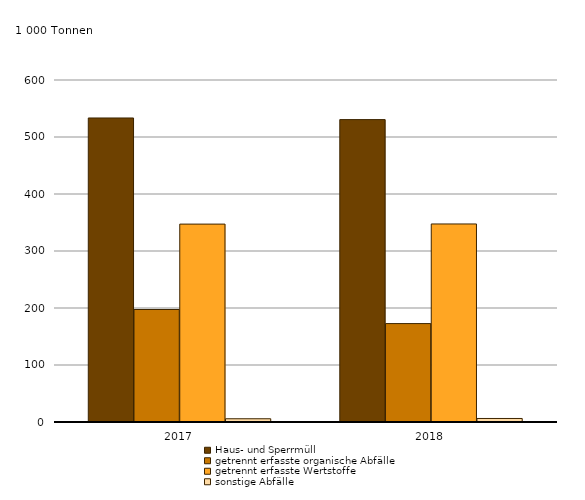
| Category | Haus- und Sperrmüll | getrennt erfasste organische Abfälle | getrennt erfasste Wertstoffe | sonstige Abfälle |
|---|---|---|---|---|
| 2017.0 | 533372 | 197387 | 347185 | 5701 |
| 2018.0 | 530518 | 172645 | 347433 | 6194 |